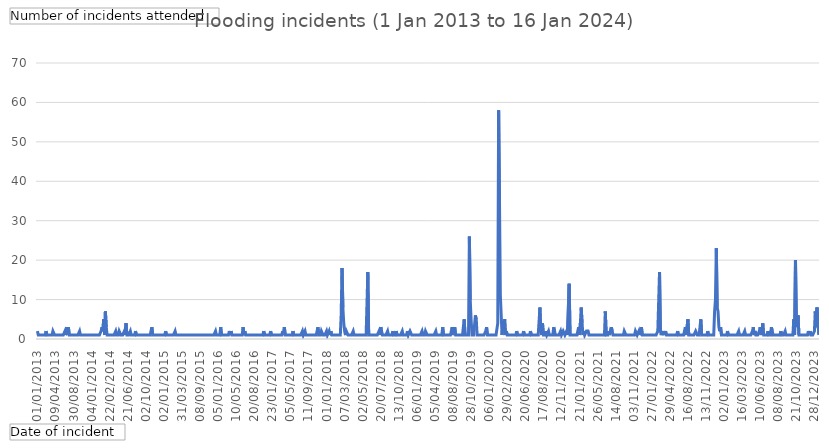
| Category | Total |
|---|---|
| 01/01/2013 | 2 |
| 02/01/2013 | 1 |
| 03/01/2013 | 1 |
| 14/01/2013 | 1 |
| 07/02/2013 | 1 |
| 08/02/2013 | 1 |
| 12/02/2013 | 1 |
| 17/02/2013 | 1 |
| 18/02/2013 | 1 |
| 19/02/2013 | 1 |
| 20/02/2013 | 2 |
| 24/02/2013 | 1 |
| 01/03/2013 | 1 |
| 06/03/2013 | 1 |
| 08/03/2013 | 1 |
| 11/03/2013 | 1 |
| 14/03/2013 | 1 |
| 18/03/2013 | 1 |
| 24/03/2013 | 2 |
| 30/03/2013 | 2 |
| 07/04/2013 | 1 |
| 09/04/2013 | 1 |
| 28/04/2013 | 1 |
| 01/05/2013 | 1 |
| 04/05/2013 | 1 |
| 12/05/2013 | 1 |
| 22/05/2013 | 1 |
| 13/06/2013 | 1 |
| 19/06/2013 | 1 |
| 25/06/2013 | 1 |
| 27/06/2013 | 1 |
| 08/07/2013 | 1 |
| 12/07/2013 | 2 |
| 22/07/2013 | 1 |
| 29/07/2013 | 3 |
| 04/08/2013 | 1 |
| 09/08/2013 | 3 |
| 17/08/2013 | 1 |
| 18/08/2013 | 1 |
| 25/08/2013 | 1 |
| 26/08/2013 | 1 |
| 29/08/2013 | 1 |
| 30/08/2013 | 1 |
| 31/08/2013 | 1 |
| 05/09/2013 | 1 |
| 25/09/2013 | 1 |
| 29/09/2013 | 1 |
| 02/10/2013 | 1 |
| 07/10/2013 | 1 |
| 14/10/2013 | 2 |
| 22/10/2013 | 1 |
| 24/10/2013 | 1 |
| 26/10/2013 | 1 |
| 31/10/2013 | 1 |
| 03/11/2013 | 1 |
| 05/11/2013 | 1 |
| 14/11/2013 | 1 |
| 23/11/2013 | 1 |
| 07/12/2013 | 1 |
| 14/12/2013 | 1 |
| 21/12/2013 | 1 |
| 22/12/2013 | 1 |
| 23/12/2013 | 1 |
| 04/01/2014 | 1 |
| 08/01/2014 | 1 |
| 09/01/2014 | 1 |
| 10/01/2014 | 1 |
| 17/01/2014 | 1 |
| 19/01/2014 | 1 |
| 21/01/2014 | 1 |
| 30/01/2014 | 1 |
| 03/02/2014 | 1 |
| 05/02/2014 | 1 |
| 07/02/2014 | 1 |
| 08/02/2014 | 2 |
| 09/02/2014 | 3 |
| 11/02/2014 | 2 |
| 12/02/2014 | 5 |
| 13/02/2014 | 1 |
| 14/02/2014 | 7 |
| 15/02/2014 | 3 |
| 16/02/2014 | 1 |
| 19/02/2014 | 1 |
| 20/02/2014 | 1 |
| 22/02/2014 | 1 |
| 23/02/2014 | 1 |
| 27/02/2014 | 1 |
| 05/03/2014 | 1 |
| 10/03/2014 | 1 |
| 19/03/2014 | 1 |
| 25/03/2014 | 1 |
| 28/03/2014 | 2 |
| 03/04/2014 | 1 |
| 04/04/2014 | 1 |
| 13/04/2014 | 1 |
| 20/04/2014 | 2 |
| 26/04/2014 | 2 |
| 02/05/2014 | 1 |
| 03/05/2014 | 1 |
| 06/05/2014 | 1 |
| 18/05/2014 | 1 |
| 29/05/2014 | 2 |
| 07/06/2014 | 1 |
| 09/06/2014 | 4 |
| 19/06/2014 | 1 |
| 21/06/2014 | 1 |
| 24/06/2014 | 1 |
| 28/06/2014 | 1 |
| 04/07/2014 | 2 |
| 05/07/2014 | 1 |
| 09/07/2014 | 1 |
| 12/07/2014 | 1 |
| 13/07/2014 | 1 |
| 19/07/2014 | 1 |
| 20/07/2014 | 2 |
| 23/07/2014 | 1 |
| 29/07/2014 | 1 |
| 02/08/2014 | 1 |
| 07/08/2014 | 1 |
| 12/09/2014 | 1 |
| 19/09/2014 | 1 |
| 20/09/2014 | 1 |
| 22/09/2014 | 1 |
| 27/09/2014 | 1 |
| 30/09/2014 | 1 |
| 01/10/2014 | 1 |
| 02/10/2014 | 1 |
| 06/10/2014 | 1 |
| 08/10/2014 | 1 |
| 12/10/2014 | 1 |
| 17/10/2014 | 1 |
| 25/10/2014 | 1 |
| 04/11/2014 | 1 |
| 08/11/2014 | 3 |
| 09/11/2014 | 1 |
| 13/11/2014 | 1 |
| 19/11/2014 | 1 |
| 24/11/2014 | 1 |
| 26/11/2014 | 1 |
| 07/12/2014 | 1 |
| 12/12/2014 | 1 |
| 16/12/2014 | 1 |
| 18/12/2014 | 1 |
| 19/12/2014 | 1 |
| 25/12/2014 | 1 |
| 29/12/2014 | 1 |
| 30/12/2014 | 1 |
| 02/01/2015 | 1 |
| 03/01/2015 | 1 |
| 05/01/2015 | 2 |
| 10/01/2015 | 1 |
| 11/01/2015 | 1 |
| 12/01/2015 | 1 |
| 17/01/2015 | 1 |
| 19/01/2015 | 1 |
| 23/01/2015 | 1 |
| 25/01/2015 | 1 |
| 13/02/2015 | 1 |
| 14/02/2015 | 1 |
| 17/02/2015 | 1 |
| 20/02/2015 | 2 |
| 22/02/2015 | 1 |
| 07/03/2015 | 1 |
| 08/03/2015 | 1 |
| 19/03/2015 | 1 |
| 21/03/2015 | 1 |
| 23/03/2015 | 1 |
| 28/03/2015 | 1 |
| 31/03/2015 | 1 |
| 18/04/2015 | 1 |
| 01/05/2015 | 1 |
| 17/05/2015 | 1 |
| 19/05/2015 | 1 |
| 24/05/2015 | 1 |
| 30/05/2015 | 1 |
| 12/06/2015 | 1 |
| 24/06/2015 | 1 |
| 28/06/2015 | 1 |
| 08/07/2015 | 1 |
| 09/07/2015 | 1 |
| 12/07/2015 | 1 |
| 29/07/2015 | 1 |
| 06/08/2015 | 1 |
| 08/08/2015 | 1 |
| 10/08/2015 | 1 |
| 22/08/2015 | 1 |
| 28/08/2015 | 1 |
| 29/08/2015 | 1 |
| 01/09/2015 | 1 |
| 08/09/2015 | 1 |
| 13/09/2015 | 1 |
| 14/09/2015 | 1 |
| 17/09/2015 | 1 |
| 18/09/2015 | 1 |
| 21/09/2015 | 1 |
| 22/09/2015 | 1 |
| 02/10/2015 | 1 |
| 05/10/2015 | 1 |
| 10/10/2015 | 1 |
| 22/10/2015 | 1 |
| 26/10/2015 | 1 |
| 28/10/2015 | 1 |
| 14/11/2015 | 1 |
| 15/11/2015 | 1 |
| 16/11/2015 | 1 |
| 18/11/2015 | 1 |
| 22/11/2015 | 1 |
| 01/12/2015 | 2 |
| 07/12/2015 | 1 |
| 01/01/2016 | 1 |
| 05/01/2016 | 1 |
| 08/01/2016 | 1 |
| 09/01/2016 | 1 |
| 14/01/2016 | 3 |
| 24/01/2016 | 1 |
| 26/01/2016 | 1 |
| 27/01/2016 | 1 |
| 29/01/2016 | 1 |
| 03/02/2016 | 1 |
| 13/02/2016 | 1 |
| 15/02/2016 | 1 |
| 06/03/2016 | 1 |
| 07/03/2016 | 1 |
| 09/03/2016 | 2 |
| 10/03/2016 | 1 |
| 11/03/2016 | 2 |
| 12/03/2016 | 1 |
| 14/04/2016 | 1 |
| 25/04/2016 | 1 |
| 28/04/2016 | 1 |
| 01/05/2016 | 1 |
| 10/05/2016 | 1 |
| 11/05/2016 | 1 |
| 21/05/2016 | 1 |
| 24/05/2016 | 1 |
| 27/05/2016 | 1 |
| 05/06/2016 | 1 |
| 06/06/2016 | 1 |
| 11/06/2016 | 1 |
| 15/06/2016 | 3 |
| 16/06/2016 | 1 |
| 24/06/2016 | 2 |
| 27/06/2016 | 1 |
| 28/06/2016 | 1 |
| 02/07/2016 | 1 |
| 17/07/2016 | 1 |
| 20/07/2016 | 1 |
| 25/07/2016 | 1 |
| 08/08/2016 | 1 |
| 10/08/2016 | 1 |
| 11/08/2016 | 1 |
| 16/08/2016 | 1 |
| 20/08/2016 | 1 |
| 22/08/2016 | 1 |
| 02/09/2016 | 1 |
| 03/09/2016 | 1 |
| 12/09/2016 | 1 |
| 17/09/2016 | 1 |
| 10/10/2016 | 1 |
| 11/10/2016 | 1 |
| 15/10/2016 | 1 |
| 31/10/2016 | 1 |
| 03/11/2016 | 1 |
| 05/11/2016 | 2 |
| 13/11/2016 | 1 |
| 19/11/2016 | 1 |
| 20/11/2016 | 1 |
| 21/11/2016 | 1 |
| 26/11/2016 | 1 |
| 30/11/2016 | 1 |
| 01/12/2016 | 1 |
| 29/12/2016 | 2 |
| 06/01/2017 | 1 |
| 23/01/2017 | 1 |
| 24/01/2017 | 1 |
| 31/01/2017 | 1 |
| 01/02/2017 | 1 |
| 03/02/2017 | 1 |
| 12/02/2017 | 1 |
| 15/02/2017 | 1 |
| 23/02/2017 | 1 |
| 24/02/2017 | 1 |
| 01/03/2017 | 1 |
| 02/03/2017 | 1 |
| 09/03/2017 | 1 |
| 18/03/2017 | 2 |
| 19/03/2017 | 1 |
| 02/04/2017 | 3 |
| 03/04/2017 | 1 |
| 11/04/2017 | 1 |
| 14/04/2017 | 1 |
| 15/04/2017 | 1 |
| 17/04/2017 | 1 |
| 24/04/2017 | 1 |
| 05/05/2017 | 1 |
| 07/05/2017 | 1 |
| 16/05/2017 | 1 |
| 17/05/2017 | 2 |
| 20/05/2017 | 1 |
| 27/05/2017 | 1 |
| 31/05/2017 | 1 |
| 01/06/2017 | 1 |
| 03/06/2017 | 1 |
| 04/06/2017 | 1 |
| 21/06/2017 | 1 |
| 23/06/2017 | 1 |
| 26/06/2017 | 1 |
| 08/07/2017 | 1 |
| 21/07/2017 | 2 |
| 25/07/2017 | 1 |
| 14/08/2017 | 1 |
| 18/08/2017 | 2 |
| 19/08/2017 | 1 |
| 29/08/2017 | 1 |
| 30/08/2017 | 1 |
| 11/09/2017 | 1 |
| 16/09/2017 | 1 |
| 24/09/2017 | 1 |
| 30/09/2017 | 1 |
| 19/10/2017 | 1 |
| 22/10/2017 | 1 |
| 23/10/2017 | 1 |
| 29/10/2017 | 1 |
| 10/11/2017 | 1 |
| 13/11/2017 | 1 |
| 18/11/2017 | 1 |
| 19/11/2017 | 3 |
| 20/11/2017 | 1 |
| 21/11/2017 | 1 |
| 27/11/2017 | 1 |
| 29/11/2017 | 2 |
| 13/12/2017 | 2 |
| 14/12/2017 | 1 |
| 15/12/2017 | 1 |
| 16/12/2017 | 1 |
| 24/12/2017 | 1 |
| 01/01/2018 | 2 |
| 13/01/2018 | 1 |
| 14/01/2018 | 1 |
| 17/01/2018 | 2 |
| 18/01/2018 | 1 |
| 20/01/2018 | 2 |
| 21/01/2018 | 1 |
| 27/01/2018 | 1 |
| 29/01/2018 | 1 |
| 31/01/2018 | 1 |
| 03/02/2018 | 1 |
| 10/02/2018 | 1 |
| 16/02/2018 | 1 |
| 17/02/2018 | 1 |
| 18/02/2018 | 1 |
| 28/02/2018 | 1 |
| 01/03/2018 | 1 |
| 02/03/2018 | 6 |
| 03/03/2018 | 18 |
| 04/03/2018 | 8 |
| 05/03/2018 | 4 |
| 07/03/2018 | 2 |
| 09/03/2018 | 1 |
| 11/03/2018 | 2 |
| 16/03/2018 | 2 |
| 17/03/2018 | 1 |
| 18/03/2018 | 1 |
| 19/03/2018 | 1 |
| 25/03/2018 | 1 |
| 26/03/2018 | 1 |
| 27/03/2018 | 1 |
| 28/03/2018 | 2 |
| 30/03/2018 | 1 |
| 04/04/2018 | 1 |
| 05/04/2018 | 1 |
| 10/04/2018 | 1 |
| 11/04/2018 | 1 |
| 18/04/2018 | 1 |
| 19/04/2018 | 1 |
| 21/04/2018 | 1 |
| 24/04/2018 | 1 |
| 26/04/2018 | 1 |
| 02/05/2018 | 1 |
| 05/05/2018 | 1 |
| 14/05/2018 | 1 |
| 16/05/2018 | 1 |
| 17/05/2018 | 1 |
| 25/05/2018 | 1 |
| 27/05/2018 | 17 |
| 29/05/2018 | 1 |
| 31/05/2018 | 1 |
| 02/06/2018 | 1 |
| 03/06/2018 | 1 |
| 05/06/2018 | 1 |
| 08/06/2018 | 1 |
| 13/06/2018 | 1 |
| 23/06/2018 | 1 |
| 26/06/2018 | 1 |
| 27/06/2018 | 1 |
| 09/07/2018 | 1 |
| 13/07/2018 | 1 |
| 18/07/2018 | 2 |
| 19/07/2018 | 1 |
| 20/07/2018 | 3 |
| 25/07/2018 | 2 |
| 27/07/2018 | 1 |
| 30/07/2018 | 1 |
| 01/08/2018 | 1 |
| 04/08/2018 | 1 |
| 09/08/2018 | 1 |
| 12/08/2018 | 1 |
| 20/08/2018 | 2 |
| 23/08/2018 | 1 |
| 02/09/2018 | 1 |
| 03/09/2018 | 1 |
| 07/09/2018 | 1 |
| 08/09/2018 | 1 |
| 11/09/2018 | 2 |
| 12/09/2018 | 1 |
| 20/09/2018 | 1 |
| 25/09/2018 | 1 |
| 28/09/2018 | 2 |
| 04/10/2018 | 1 |
| 12/10/2018 | 1 |
| 13/10/2018 | 1 |
| 16/10/2018 | 1 |
| 21/10/2018 | 1 |
| 24/10/2018 | 1 |
| 26/10/2018 | 2 |
| 27/10/2018 | 1 |
| 02/11/2018 | 1 |
| 07/11/2018 | 1 |
| 09/11/2018 | 1 |
| 10/11/2018 | 1 |
| 18/11/2018 | 2 |
| 26/11/2018 | 1 |
| 28/11/2018 | 1 |
| 30/11/2018 | 2 |
| 06/12/2018 | 2 |
| 09/12/2018 | 1 |
| 15/12/2018 | 1 |
| 17/12/2018 | 1 |
| 18/12/2018 | 1 |
| 26/12/2018 | 1 |
| 01/01/2019 | 1 |
| 06/01/2019 | 1 |
| 09/01/2019 | 1 |
| 10/01/2019 | 1 |
| 27/01/2019 | 1 |
| 28/01/2019 | 1 |
| 29/01/2019 | 1 |
| 02/02/2019 | 2 |
| 08/02/2019 | 1 |
| 10/02/2019 | 1 |
| 14/02/2019 | 1 |
| 17/02/2019 | 2 |
| 18/02/2019 | 2 |
| 20/02/2019 | 1 |
| 28/02/2019 | 1 |
| 16/03/2019 | 1 |
| 19/03/2019 | 1 |
| 20/03/2019 | 1 |
| 21/03/2019 | 1 |
| 26/03/2019 | 1 |
| 28/03/2019 | 1 |
| 03/04/2019 | 1 |
| 05/04/2019 | 1 |
| 20/04/2019 | 2 |
| 24/04/2019 | 1 |
| 02/05/2019 | 1 |
| 08/05/2019 | 1 |
| 09/05/2019 | 1 |
| 27/05/2019 | 1 |
| 06/06/2019 | 1 |
| 11/06/2019 | 1 |
| 12/06/2019 | 3 |
| 20/06/2019 | 1 |
| 27/06/2019 | 1 |
| 28/06/2019 | 1 |
| 04/07/2019 | 1 |
| 06/07/2019 | 1 |
| 07/07/2019 | 1 |
| 10/07/2019 | 1 |
| 11/07/2019 | 1 |
| 22/07/2019 | 1 |
| 29/07/2019 | 1 |
| 30/07/2019 | 3 |
| 08/08/2019 | 1 |
| 09/08/2019 | 2 |
| 11/08/2019 | 3 |
| 12/08/2019 | 1 |
| 20/08/2019 | 1 |
| 31/08/2019 | 1 |
| 02/09/2019 | 1 |
| 09/09/2019 | 1 |
| 12/09/2019 | 1 |
| 14/09/2019 | 1 |
| 17/09/2019 | 1 |
| 18/09/2019 | 1 |
| 19/09/2019 | 1 |
| 24/09/2019 | 5 |
| 27/09/2019 | 1 |
| 07/10/2019 | 1 |
| 10/10/2019 | 1 |
| 11/10/2019 | 1 |
| 20/10/2019 | 1 |
| 26/10/2019 | 26 |
| 27/10/2019 | 10 |
| 28/10/2019 | 5 |
| 02/11/2019 | 1 |
| 08/11/2019 | 1 |
| 10/11/2019 | 1 |
| 13/11/2019 | 1 |
| 14/11/2019 | 6 |
| 15/11/2019 | 5 |
| 16/11/2019 | 1 |
| 17/11/2019 | 1 |
| 19/11/2019 | 1 |
| 25/11/2019 | 1 |
| 09/12/2019 | 1 |
| 11/12/2019 | 1 |
| 15/12/2019 | 1 |
| 17/12/2019 | 1 |
| 18/12/2019 | 1 |
| 19/12/2019 | 1 |
| 20/12/2019 | 2 |
| 21/12/2019 | 3 |
| 30/12/2019 | 1 |
| 02/01/2020 | 1 |
| 06/01/2020 | 1 |
| 09/01/2020 | 1 |
| 17/01/2020 | 1 |
| 21/01/2020 | 1 |
| 26/01/2020 | 1 |
| 31/01/2020 | 1 |
| 07/02/2020 | 1 |
| 08/02/2020 | 1 |
| 09/02/2020 | 1 |
| 10/02/2020 | 1 |
| 15/02/2020 | 4 |
| 16/02/2020 | 58 |
| 17/02/2020 | 35 |
| 18/02/2020 | 11 |
| 19/02/2020 | 11 |
| 20/02/2020 | 1 |
| 21/02/2020 | 4 |
| 25/02/2020 | 2 |
| 26/02/2020 | 5 |
| 27/02/2020 | 1 |
| 28/02/2020 | 2 |
| 29/02/2020 | 1 |
| 02/03/2020 | 1 |
| 05/03/2020 | 1 |
| 07/03/2020 | 1 |
| 08/03/2020 | 1 |
| 09/03/2020 | 1 |
| 28/03/2020 | 1 |
| 03/04/2020 | 1 |
| 08/04/2020 | 1 |
| 11/04/2020 | 1 |
| 13/04/2020 | 1 |
| 25/04/2020 | 2 |
| 02/05/2020 | 1 |
| 08/05/2020 | 1 |
| 09/05/2020 | 1 |
| 17/05/2020 | 1 |
| 28/05/2020 | 1 |
| 04/06/2020 | 1 |
| 08/06/2020 | 1 |
| 16/06/2020 | 2 |
| 18/06/2020 | 1 |
| 20/06/2020 | 1 |
| 25/06/2020 | 1 |
| 28/06/2020 | 1 |
| 30/06/2020 | 1 |
| 03/07/2020 | 1 |
| 04/07/2020 | 1 |
| 09/07/2020 | 2 |
| 10/07/2020 | 1 |
| 12/07/2020 | 1 |
| 15/07/2020 | 1 |
| 24/07/2020 | 1 |
| 31/07/2020 | 1 |
| 02/08/2020 | 1 |
| 04/08/2020 | 1 |
| 07/08/2020 | 1 |
| 09/08/2020 | 1 |
| 10/08/2020 | 1 |
| 12/08/2020 | 8 |
| 13/08/2020 | 2 |
| 14/08/2020 | 1 |
| 16/08/2020 | 4 |
| 17/08/2020 | 1 |
| 19/08/2020 | 1 |
| 23/08/2020 | 1 |
| 28/08/2020 | 2 |
| 29/08/2020 | 1 |
| 31/08/2020 | 1 |
| 02/09/2020 | 2 |
| 07/09/2020 | 1 |
| 11/09/2020 | 1 |
| 14/09/2020 | 1 |
| 18/09/2020 | 1 |
| 25/09/2020 | 1 |
| 04/10/2020 | 3 |
| 06/10/2020 | 2 |
| 12/10/2020 | 1 |
| 16/10/2020 | 1 |
| 19/10/2020 | 1 |
| 24/10/2020 | 1 |
| 28/10/2020 | 1 |
| 31/10/2020 | 1 |
| 01/11/2020 | 2 |
| 12/11/2020 | 1 |
| 17/11/2020 | 1 |
| 22/11/2020 | 2 |
| 03/12/2020 | 2 |
| 04/12/2020 | 1 |
| 15/12/2020 | 1 |
| 16/12/2020 | 2 |
| 18/12/2020 | 1 |
| 21/12/2020 | 1 |
| 23/12/2020 | 14 |
| 24/12/2020 | 1 |
| 25/12/2020 | 1 |
| 31/12/2020 | 1 |
| 02/01/2021 | 1 |
| 03/01/2021 | 1 |
| 09/01/2021 | 1 |
| 11/01/2021 | 1 |
| 13/01/2021 | 1 |
| 14/01/2021 | 1 |
| 19/01/2021 | 1 |
| 20/01/2021 | 3 |
| 21/01/2021 | 1 |
| 22/01/2021 | 4 |
| 23/01/2021 | 8 |
| 24/01/2021 | 4 |
| 29/01/2021 | 1 |
| 30/01/2021 | 2 |
| 31/01/2021 | 1 |
| 02/02/2021 | 1 |
| 13/02/2021 | 2 |
| 14/02/2021 | 2 |
| 15/02/2021 | 2 |
| 18/02/2021 | 1 |
| 27/02/2021 | 1 |
| 02/03/2021 | 1 |
| 15/03/2021 | 1 |
| 20/03/2021 | 1 |
| 04/04/2021 | 1 |
| 15/04/2021 | 1 |
| 03/05/2021 | 1 |
| 08/05/2021 | 1 |
| 20/05/2021 | 1 |
| 26/05/2021 | 1 |
| 07/06/2021 | 1 |
| 08/06/2021 | 1 |
| 09/06/2021 | 1 |
| 10/06/2021 | 1 |
| 15/06/2021 | 1 |
| 17/06/2021 | 1 |
| 18/06/2021 | 1 |
| 24/06/2021 | 1 |
| 25/06/2021 | 7 |
| 01/07/2021 | 1 |
| 05/07/2021 | 1 |
| 07/07/2021 | 1 |
| 12/07/2021 | 2 |
| 19/07/2021 | 1 |
| 25/07/2021 | 1 |
| 26/07/2021 | 3 |
| 29/07/2021 | 2 |
| 03/08/2021 | 1 |
| 09/08/2021 | 1 |
| 10/08/2021 | 1 |
| 14/08/2021 | 1 |
| 23/08/2021 | 1 |
| 25/08/2021 | 1 |
| 27/08/2021 | 1 |
| 05/09/2021 | 1 |
| 10/09/2021 | 1 |
| 12/09/2021 | 1 |
| 22/09/2021 | 1 |
| 24/09/2021 | 1 |
| 27/09/2021 | 1 |
| 04/10/2021 | 2 |
| 05/10/2021 | 2 |
| 08/10/2021 | 1 |
| 14/10/2021 | 1 |
| 16/10/2021 | 1 |
| 21/10/2021 | 1 |
| 22/10/2021 | 1 |
| 25/10/2021 | 1 |
| 29/10/2021 | 1 |
| 30/10/2021 | 1 |
| 01/11/2021 | 1 |
| 03/11/2021 | 1 |
| 04/11/2021 | 1 |
| 05/11/2021 | 2 |
| 07/11/2021 | 2 |
| 16/11/2021 | 1 |
| 19/11/2021 | 1 |
| 22/11/2021 | 2 |
| 27/11/2021 | 1 |
| 28/11/2021 | 1 |
| 03/12/2021 | 3 |
| 05/12/2021 | 1 |
| 08/12/2021 | 1 |
| 15/12/2021 | 1 |
| 24/12/2021 | 1 |
| 27/12/2021 | 1 |
| 05/01/2022 | 1 |
| 07/01/2022 | 1 |
| 10/01/2022 | 1 |
| 21/01/2022 | 1 |
| 24/01/2022 | 1 |
| 25/01/2022 | 1 |
| 27/01/2022 | 1 |
| 31/01/2022 | 1 |
| 07/02/2022 | 1 |
| 08/02/2022 | 1 |
| 11/02/2022 | 1 |
| 17/02/2022 | 1 |
| 20/02/2022 | 1 |
| 21/02/2022 | 2 |
| 22/02/2022 | 2 |
| 23/02/2022 | 17 |
| 24/02/2022 | 2 |
| 25/02/2022 | 1 |
| 26/02/2022 | 2 |
| 10/03/2022 | 1 |
| 17/03/2022 | 2 |
| 25/03/2022 | 1 |
| 26/03/2022 | 2 |
| 02/04/2022 | 1 |
| 03/04/2022 | 1 |
| 05/04/2022 | 1 |
| 13/04/2022 | 1 |
| 29/04/2022 | 1 |
| 18/05/2022 | 1 |
| 23/05/2022 | 1 |
| 30/05/2022 | 1 |
| 03/06/2022 | 1 |
| 05/06/2022 | 1 |
| 07/06/2022 | 1 |
| 18/06/2022 | 1 |
| 23/06/2022 | 1 |
| 01/07/2022 | 2 |
| 02/07/2022 | 1 |
| 13/07/2022 | 1 |
| 20/07/2022 | 1 |
| 22/07/2022 | 1 |
| 23/07/2022 | 1 |
| 24/07/2022 | 1 |
| 29/07/2022 | 1 |
| 03/08/2022 | 1 |
| 08/08/2022 | 3 |
| 10/08/2022 | 1 |
| 11/08/2022 | 1 |
| 16/08/2022 | 5 |
| 17/08/2022 | 1 |
| 19/08/2022 | 1 |
| 21/08/2022 | 1 |
| 23/08/2022 | 1 |
| 25/08/2022 | 1 |
| 05/09/2022 | 1 |
| 08/09/2022 | 1 |
| 13/09/2022 | 1 |
| 24/09/2022 | 2 |
| 26/09/2022 | 2 |
| 05/10/2022 | 1 |
| 13/10/2022 | 1 |
| 15/10/2022 | 1 |
| 16/10/2022 | 1 |
| 23/10/2022 | 5 |
| 24/10/2022 | 1 |
| 25/10/2022 | 1 |
| 01/11/2022 | 1 |
| 08/11/2022 | 1 |
| 09/11/2022 | 1 |
| 13/11/2022 | 1 |
| 14/11/2022 | 1 |
| 21/11/2022 | 2 |
| 23/11/2022 | 1 |
| 29/11/2022 | 1 |
| 05/12/2022 | 1 |
| 07/12/2022 | 1 |
| 08/12/2022 | 1 |
| 09/12/2022 | 1 |
| 13/12/2022 | 1 |
| 15/12/2022 | 7 |
| 16/12/2022 | 10 |
| 17/12/2022 | 23 |
| 18/12/2022 | 8 |
| 19/12/2022 | 7 |
| 20/12/2022 | 3 |
| 25/12/2022 | 2 |
| 26/12/2022 | 3 |
| 27/12/2022 | 1 |
| 31/12/2022 | 1 |
| 01/01/2023 | 1 |
| 02/01/2023 | 1 |
| 08/01/2023 | 1 |
| 11/01/2023 | 1 |
| 12/01/2023 | 1 |
| 13/01/2023 | 2 |
| 18/01/2023 | 1 |
| 20/01/2023 | 1 |
| 23/01/2023 | 1 |
| 26/01/2023 | 1 |
| 31/01/2023 | 1 |
| 05/02/2023 | 1 |
| 11/02/2023 | 1 |
| 14/02/2023 | 1 |
| 17/02/2023 | 1 |
| 18/02/2023 | 1 |
| 19/02/2023 | 1 |
| 28/02/2023 | 1 |
| 06/03/2023 | 2 |
| 09/03/2023 | 1 |
| 11/03/2023 | 1 |
| 14/03/2023 | 1 |
| 16/03/2023 | 1 |
| 19/03/2023 | 1 |
| 20/03/2023 | 1 |
| 31/03/2023 | 2 |
| 01/04/2023 | 1 |
| 08/04/2023 | 1 |
| 09/04/2023 | 1 |
| 15/04/2023 | 1 |
| 16/04/2023 | 1 |
| 20/04/2023 | 1 |
| 27/04/2023 | 1 |
| 03/05/2023 | 1 |
| 09/05/2023 | 2 |
| 11/05/2023 | 3 |
| 14/05/2023 | 1 |
| 16/05/2023 | 2 |
| 18/05/2023 | 1 |
| 21/05/2023 | 1 |
| 29/05/2023 | 1 |
| 31/05/2023 | 1 |
| 06/06/2023 | 2 |
| 10/06/2023 | 3 |
| 11/06/2023 | 1 |
| 15/06/2023 | 2 |
| 18/06/2023 | 4 |
| 20/06/2023 | 1 |
| 24/06/2023 | 1 |
| 25/06/2023 | 1 |
| 27/06/2023 | 1 |
| 28/06/2023 | 1 |
| 29/06/2023 | 2 |
| 02/07/2023 | 1 |
| 05/07/2023 | 1 |
| 07/07/2023 | 1 |
| 08/07/2023 | 3 |
| 09/07/2023 | 2 |
| 11/07/2023 | 1 |
| 22/07/2023 | 1 |
| 23/07/2023 | 1 |
| 29/07/2023 | 1 |
| 02/08/2023 | 1 |
| 06/08/2023 | 1 |
| 08/08/2023 | 1 |
| 14/08/2023 | 1 |
| 19/08/2023 | 1 |
| 22/08/2023 | 2 |
| 30/08/2023 | 1 |
| 03/09/2023 | 1 |
| 07/09/2023 | 1 |
| 10/09/2023 | 1 |
| 16/09/2023 | 2 |
| 18/09/2023 | 1 |
| 23/09/2023 | 1 |
| 02/10/2023 | 1 |
| 03/10/2023 | 1 |
| 05/10/2023 | 1 |
| 08/10/2023 | 1 |
| 13/10/2023 | 1 |
| 14/10/2023 | 1 |
| 15/10/2023 | 1 |
| 18/10/2023 | 5 |
| 19/10/2023 | 1 |
| 20/10/2023 | 20 |
| 21/10/2023 | 5 |
| 22/10/2023 | 3 |
| 23/10/2023 | 6 |
| 24/10/2023 | 1 |
| 29/10/2023 | 1 |
| 04/11/2023 | 1 |
| 07/11/2023 | 1 |
| 09/11/2023 | 1 |
| 11/11/2023 | 1 |
| 23/11/2023 | 1 |
| 25/11/2023 | 1 |
| 01/12/2023 | 1 |
| 03/12/2023 | 1 |
| 04/12/2023 | 1 |
| 10/12/2023 | 2 |
| 13/12/2023 | 1 |
| 17/12/2023 | 2 |
| 18/12/2023 | 1 |
| 21/12/2023 | 1 |
| 23/12/2023 | 1 |
| 27/12/2023 | 1 |
| 28/12/2023 | 2 |
| 02/01/2024 | 7 |
| 03/01/2024 | 3 |
| 04/01/2024 | 8 |
| 05/01/2024 | 5 |
| 06/01/2024 | 1 |
| 11/01/2024 | 1 |